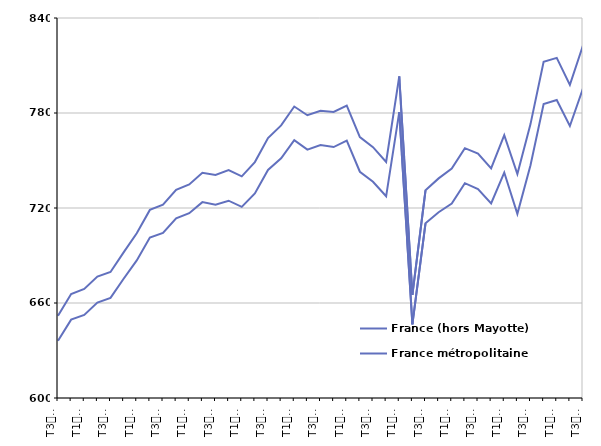
| Category | France (hors Mayotte) | France métropolitaine |
|---|---|---|
| T3
2013 | 652 | 636.2 |
| T4
2013 | 665.7 | 649.5 |
| T1
2014 | 668.9 | 652.5 |
| T2
2014 | 676.7 | 660.3 |
| T3
2014 | 679.6 | 663.2 |
| T4
2014 | 692 | 675.3 |
| T1
2015 | 704 | 686.9 |
| T2
2015 | 718.8 | 701.3 |
| T3
2015 | 722.1 | 704.3 |
| T4
2015 | 731.5 | 713.5 |
| T1
2016 | 734.9 | 716.7 |
| T2
2016 | 742.2 | 723.7 |
| T3
2016 | 740.9 | 722.1 |
| T4
2016 | 743.9 | 724.6 |
| T1
2017 | 740 | 720.7 |
| T2
2017 | 749 | 729.2 |
| T3
2017 | 764.2 | 744 |
| T4
2017 | 772.2 | 751.4 |
| T1
2018 | 784.1 | 762.9 |
| T2
2018 | 778.6 | 756.9 |
| T3
2018 | 781.4 | 759.8 |
| T4
2018 | 780.7 | 758.5 |
| T1
2019 | 784.6 | 762.5 |
| T2
2019 | 764.8 | 742.9 |
| T3
2019 | 758.4 | 736.6 |
| T4
2019 | 749.1 | 727.4 |
| T1
2020 | 803.1 | 780.6 |
| T2
2020 | 665.2 | 646.5 |
| T3
2020 | 731.2 | 710.3 |
| T4
2020 | 738.7 | 717.3 |
| T1
2021 | 744.9 | 722.8 |
| T2
2021 | 757.8 | 735.7 |
| T3
2021 | 754.4 | 732 |
| T4
2021 | 745 | 722.9 |
| T1
2022 | 766 | 742.4 |
| T2
2022 | 741.5 | 716.3 |
| T3
2022 | 773 | 747 |
| T4
2022 | 812.3 | 785.7 |
| T1
2023 | 814.8 | 788.2 |
| T2
2023 | 797.8 | 771.8 |
| T3
2023 | 822.7 | 795.6 |